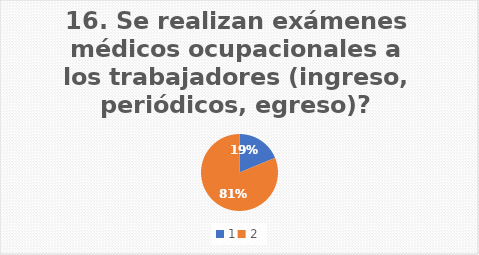
| Category | Se realizan exámenes médicos ocupacionales a los trabajadores (ingreso, periódicos, egreso)? |
|---|---|
| 0 | 18.75 |
| 1 | 81.25 |